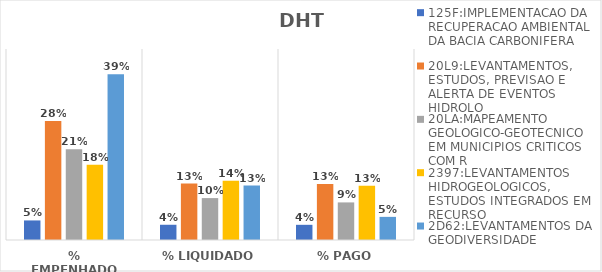
| Category | 125F:IMPLEMENTACAO DA RECUPERACAO AMBIENTAL DA BACIA CARBONIFERA | 20L9:LEVANTAMENTOS, ESTUDOS, PREVISAO E ALERTA DE EVENTOS HIDROLO | 20LA:MAPEAMENTO GEOLOGICO-GEOTECNICO EM MUNICIPIOS CRITICOS COM R | 2397:LEVANTAMENTOS HIDROGEOLOGICOS, ESTUDOS INTEGRADOS EM RECURSO | 2D62:LEVANTAMENTOS DA GEODIVERSIDADE |
|---|---|---|---|---|---|
| % EMPENHADO | 0.046 | 0.28 | 0.214 | 0.177 | 0.39 |
| % LIQUIDADO | 0.036 | 0.133 | 0.099 | 0.14 | 0.128 |
| % PAGO | 0.036 | 0.132 | 0.089 | 0.128 | 0.054 |